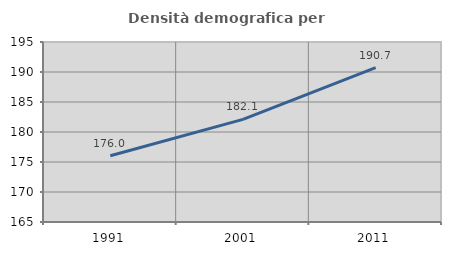
| Category | Densità demografica |
|---|---|
| 1991.0 | 176.033 |
| 2001.0 | 182.099 |
| 2011.0 | 190.732 |